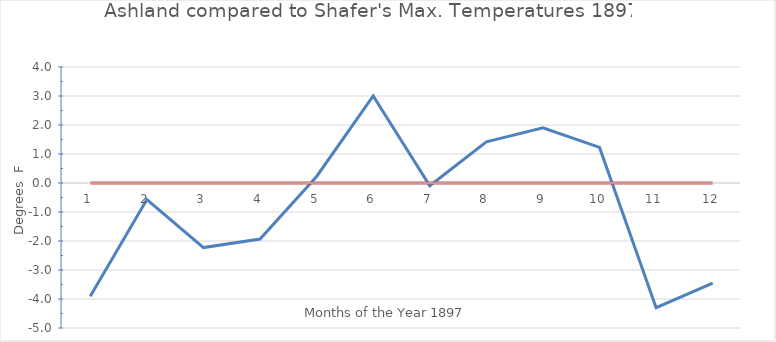
| Category | Diff. | Month |
|---|---|---|
| 0 | -3.903 | 0 |
| 1 | -0.571 | 0 |
| 2 | -2.226 | 0 |
| 3 | -1.933 | 0 |
| 4 | 0.226 | 0 |
| 5 | 3 | 0 |
| 6 | -0.097 | 0 |
| 7 | 1.419 | 0 |
| 8 | 1.9 | 0 |
| 9 | 1.226 | 0 |
| 10 | -4.3 | 0 |
| 11 | -3.452 | 0 |